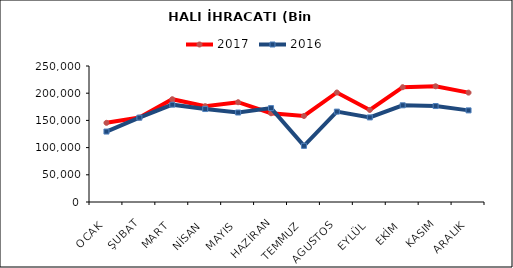
| Category | 2017 | 2016 |
|---|---|---|
| OCAK | 145550.69 | 129495.756 |
| ŞUBAT | 155167.384 | 155035.064 |
| MART | 188937.721 | 178923.853 |
| NİSAN | 176124.623 | 170894.064 |
| MAYIS | 183417.445 | 164493.133 |
| HAZİRAN | 163116.75 | 172579.001 |
| TEMMUZ | 158118.469 | 103247.81 |
| AGUSTOS | 201302.385 | 166134.8 |
| EYLÜL | 169207.314 | 155502.632 |
| EKİM | 211012.579 | 177740.099 |
| KASIM | 212703.767 | 176412.998 |
| ARALIK | 201029.737 | 168412.978 |